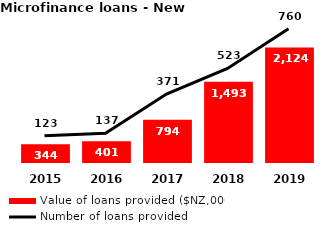
| Category | Value of loans provided ($NZ,000) |
|---|---|
| 2019.0 | 2123.584 |
| 2018.0 | 1493 |
| 2017.0 | 794 |
| 2016.0 | 401 |
| 2015.0 | 344 |